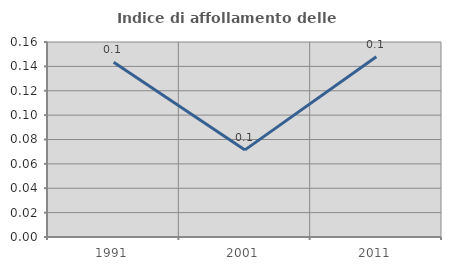
| Category | Indice di affollamento delle abitazioni  |
|---|---|
| 1991.0 | 0.143 |
| 2001.0 | 0.071 |
| 2011.0 | 0.148 |